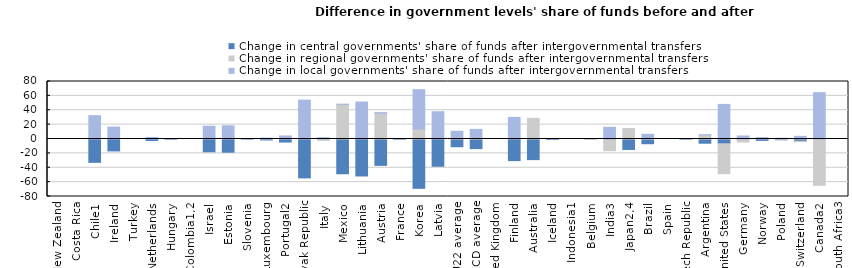
| Category | Change in central governments' share of funds after intergovernmental transfers | Change in regional governments' share of funds after intergovernmental transfers | Change in local governments' share of funds after intergovernmental transfers |
|---|---|---|---|
| New Zealand | 0 | 0 | 0 |
| Costa Rica | 0 | 0 | 0 |
| Chile1 | -32.493 | 0 | 32.493 |
| Ireland | -16.596 | 0 | 16.596 |
| Turkey | 0 | 0 | 0 |
| Netherlands | -2.164 | 0 | 2.164 |
| Hungary | -0.264 | 0 | 0.264 |
| Colombia1,2 | 0 | 0 | 0 |
| Israel | -17.779 | 0 | 17.779 |
| Estonia | -18.369 | 0 | 18.369 |
| Slovenia | -0.087 | 0 | 0.087 |
| Luxembourg | -1.301 | 0 | 1.301 |
| Portugal2 | -4.244 | 0 | 4.244 |
| Slovak Republic | -54.1 | 0 | 54.1 |
| Italy | -0.564 | -1.319 | 1.882 |
| Mexico | -48.378 | 48.248 | 0.13 |
| Lithuania | -51.416 | 0 | 51.416 |
| Austria | -36.661 | 35.885 | 0.776 |
| France | -0.665 | 0.04 | 0.625 |
| Korea | -68.589 | 13.849 | 54.74 |
| Latvia | -37.936 | 0 | 37.936 |
| EU22 average | -10.758 | 1.619 | 9.14 |
| OECD average | -13.371 | 0.542 | 12.829 |
| United Kingdom | 0 | 0 | 0 |
| Finland | -30.077 | 0 | 30.077 |
| Australia | -28.697 | 28.697 | 0 |
| Iceland | -0.604 | 0 | 0.604 |
| Indonesia1 | 0 | 0 | 0 |
| Belgium | 0.574 | -0.574 | 0 |
| India3 | 0 | -16.264 | 16.264 |
| Japan2,4 | -14.567 | 14.567 | 0 |
| Brazil | -6.567 | 0.027 | 6.539 |
| Spain | 0 | 0 | 0 |
| Czech Republic | -0.42 | 0.42 | 0 |
| Argentina | -5.86 | 5.536 | 0.324 |
| United States | -6.662 | -41.498 | 48.16 |
| Germany | -0.516 | -3.675 | 4.19 |
| Norway | -1.942 | 0 | 1.942 |
| Poland | -1.022 | -0.021 | 1.043 |
| Switzerland | -3.127 | -0.582 | 3.71 |
| Canada2 | -0.617 | -63.864 | 64.48 |
| South Africa3 | 0 | 0 | 0 |